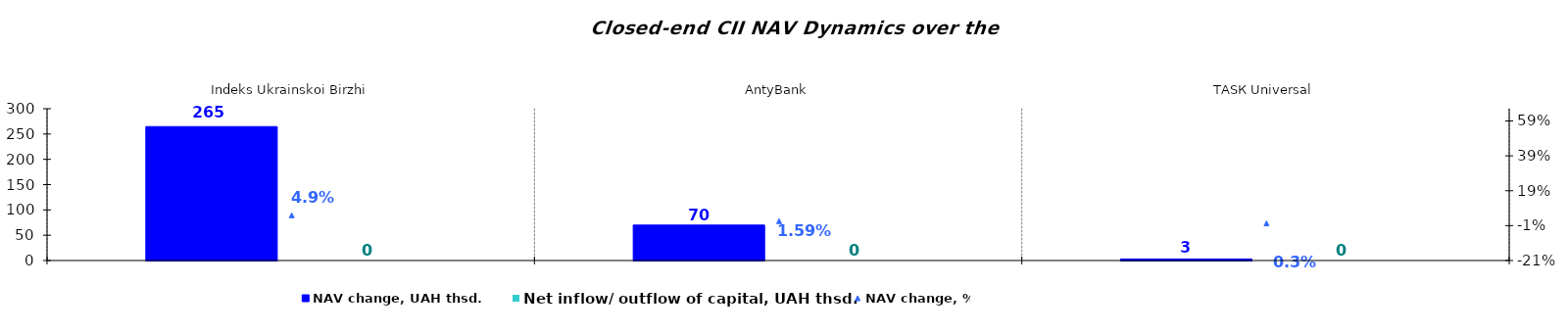
| Category | NAV change, UAH thsd. | Net inflow/ outflow of capital, UAH thsd. |
|---|---|---|
| Indeks Ukrainskoi Birzhi | 264.701 | 0 |
| AntyBank | 70.033 | 0 |
| ТАSК Universal | 3.041 | 0 |